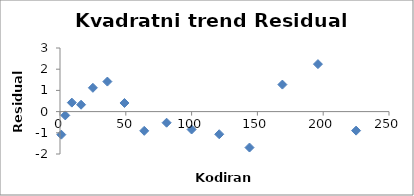
| Category | Series 0 |
|---|---|
| 1.0 | -1.088 |
| 4.0 | -0.18 |
| 9.0 | 0.424 |
| 16.0 | 0.325 |
| 25.0 | 1.122 |
| 36.0 | 1.416 |
| 49.0 | 0.406 |
| 64.0 | -0.907 |
| 81.0 | -0.524 |
| 100.0 | -0.844 |
| 121.0 | -1.068 |
| 144.0 | -1.695 |
| 169.0 | 1.274 |
| 196.0 | 2.24 |
| 225.0 | -0.898 |